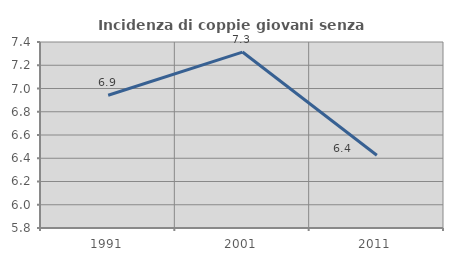
| Category | Incidenza di coppie giovani senza figli |
|---|---|
| 1991.0 | 6.942 |
| 2001.0 | 7.313 |
| 2011.0 | 6.426 |